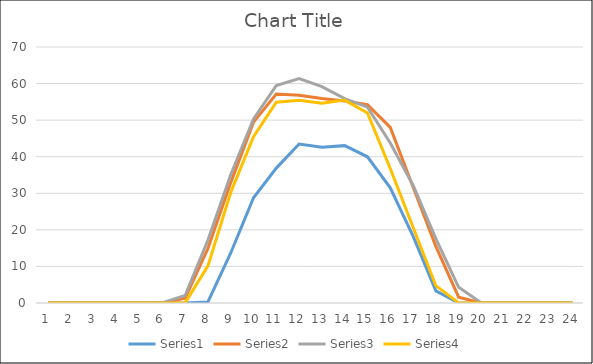
| Category | Series 0 | Series 1 | Series 2 | Series 3 |
|---|---|---|---|---|
| 0 | 0 | 0 | 0 | 0 |
| 1 | 0 | 0 | 0 | 0 |
| 2 | 0 | 0 | 0 | 0 |
| 3 | 0 | 0 | 0 | 0 |
| 4 | 0 | 0 | 0 | 0 |
| 5 | 0 | 0.005 | 0.047 | 0 |
| 6 | 0 | 1.34 | 2.058 | 0.03 |
| 7 | 0.307 | 14.902 | 17.205 | 10.157 |
| 8 | 13.68 | 32.917 | 35.079 | 30.206 |
| 9 | 28.77 | 49.45 | 50.348 | 45.498 |
| 10 | 36.888 | 57.147 | 59.482 | 54.905 |
| 11 | 43.456 | 56.813 | 61.348 | 55.458 |
| 12 | 42.582 | 55.9 | 59.171 | 54.59 |
| 13 | 43.028 | 55.21 | 55.871 | 55.481 |
| 14 | 39.979 | 54.201 | 53.545 | 51.949 |
| 15 | 31.479 | 48.013 | 43.764 | 36.766 |
| 16 | 18.27 | 31.729 | 32.204 | 20.719 |
| 17 | 3.312 | 15.477 | 17.616 | 4.735 |
| 18 | 0 | 1.581 | 4.302 | 0.007 |
| 19 | 0 | 0.001 | 0.033 | 0 |
| 20 | 0 | 0 | 0 | 0 |
| 21 | 0 | 0 | 0 | 0 |
| 22 | 0 | 0 | 0 | 0 |
| 23 | 0 | 0 | 0 | 0 |